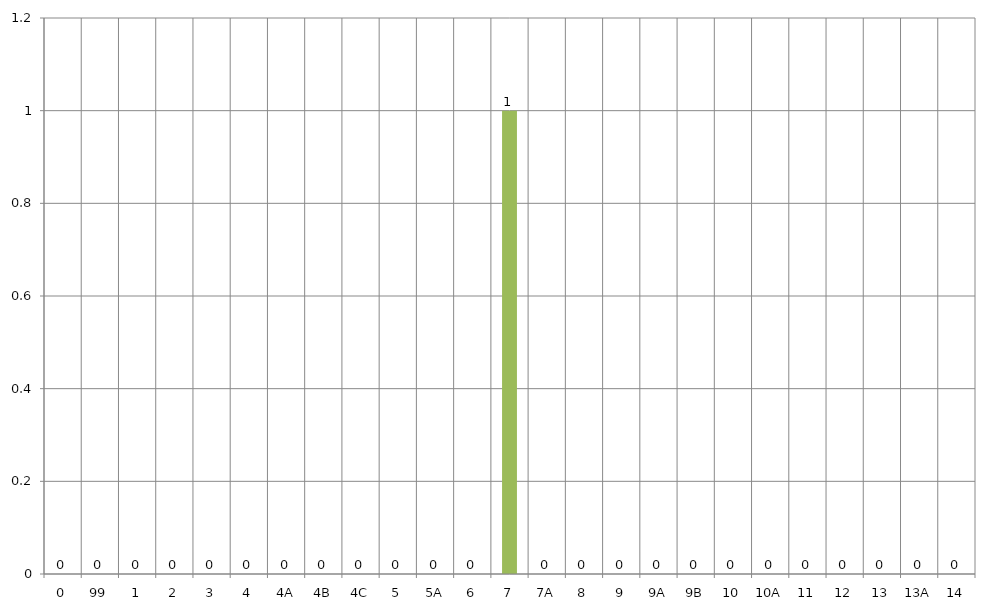
| Category | Totals |
|---|---|
| 0 | 0 |
| 99 | 0 |
| 1 | 0 |
| 2 | 0 |
| 3 | 0 |
| 4 | 0 |
| 4A | 0 |
| 4B | 0 |
| 4C | 0 |
| 5 | 0 |
| 5A | 0 |
| 6 | 0 |
| 7 | 1 |
| 7A | 0 |
| 8 | 0 |
| 9 | 0 |
| 9A | 0 |
| 9B | 0 |
| 10 | 0 |
| 10A | 0 |
| 11 | 0 |
| 12 | 0 |
| 13 | 0 |
| 13A | 0 |
| 14 | 0 |